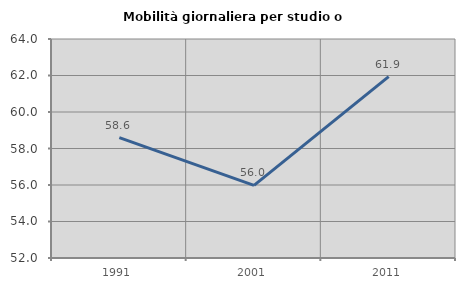
| Category | Mobilità giornaliera per studio o lavoro |
|---|---|
| 1991.0 | 58.598 |
| 2001.0 | 55.982 |
| 2011.0 | 61.935 |